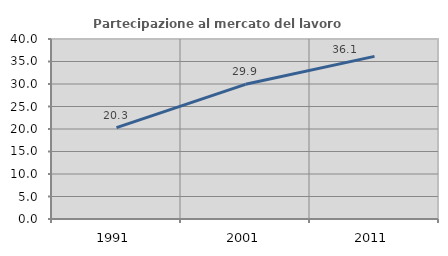
| Category | Partecipazione al mercato del lavoro  femminile |
|---|---|
| 1991.0 | 20.301 |
| 2001.0 | 29.927 |
| 2011.0 | 36.134 |